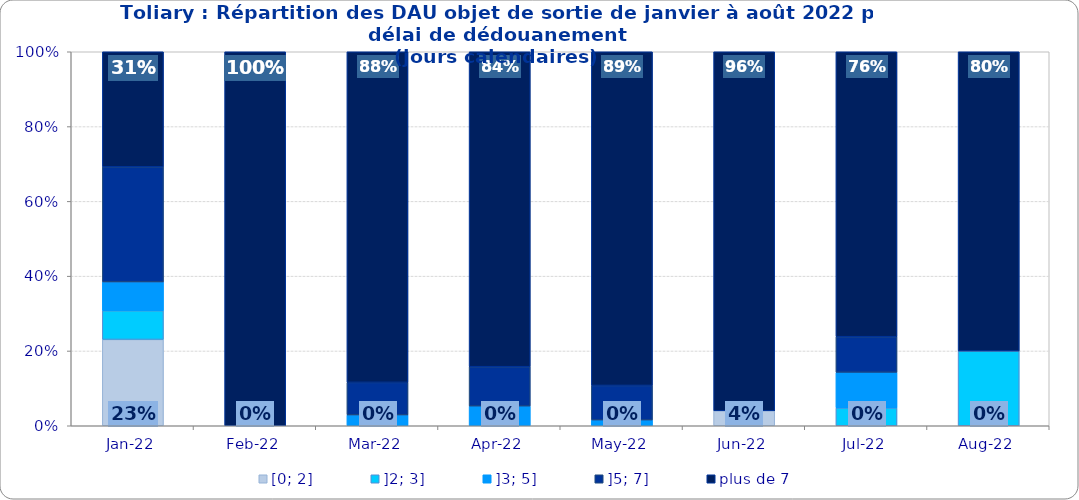
| Category | [0; 2] | ]2; 3] | ]3; 5] | ]5; 7] | plus de 7 |
|---|---|---|---|---|---|
| 2022-01-01 | 0.231 | 0.077 | 0.077 | 0.308 | 0.308 |
| 2022-02-01 | 0 | 0 | 0 | 0 | 1 |
| 2022-03-01 | 0 | 0 | 0.029 | 0.087 | 0.884 |
| 2022-04-01 | 0 | 0 | 0.053 | 0.105 | 0.842 |
| 2022-05-01 | 0 | 0 | 0.015 | 0.092 | 0.892 |
| 2022-06-01 | 0.04 | 0 | 0 | 0 | 0.96 |
| 2022-07-01 | 0 | 0.048 | 0.095 | 0.095 | 0.762 |
| 2022-08-01 | 0 | 0.2 | 0 | 0 | 0.8 |